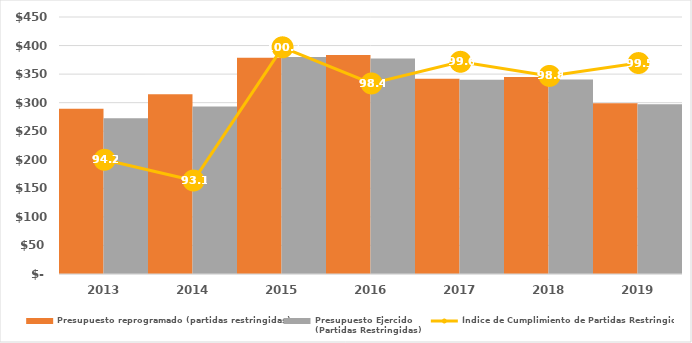
| Category | Presupuesto reprogramado (partidas restringidas) | Presupuesto Ejercido
(Partidas Restringidas) |
|---|---|---|
| 2013.0 | 289428.733 | 272702.822 |
| 2014.0 | 314864.8 | 293113.7 |
| 2015.0 | 378700.3 | 380021.6 |
| 2016.0 | 383632 | 377416.6 |
| 2017.0 | 341839.2 | 340334.7 |
| 2018.0 | 344938.7 | 340765 |
| 2019.0 | 298904.428 | 297383.7 |